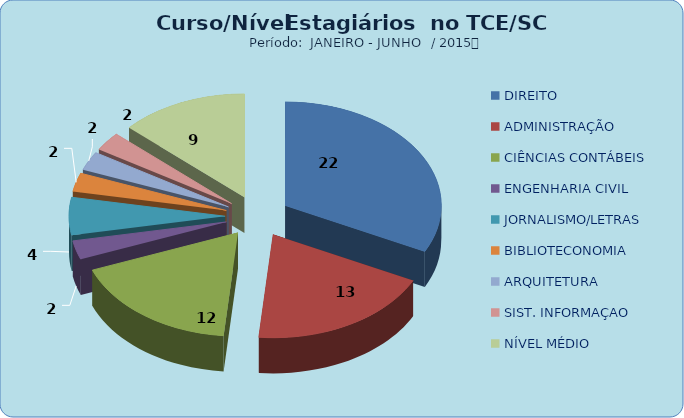
| Category | Series 0 |
|---|---|
| DIREITO | 22 |
| ADMINISTRAÇÃO | 13 |
| CIÊNCIAS CONTÁBEIS | 12 |
| ENGENHARIA CIVIL | 2 |
| JORNALISMO/LETRAS | 4 |
| BIBLIOTECONOMIA | 2 |
| ARQUITETURA | 2 |
| SIST. INFORMAÇAO | 2 |
| NÍVEL MÉDIO | 9 |